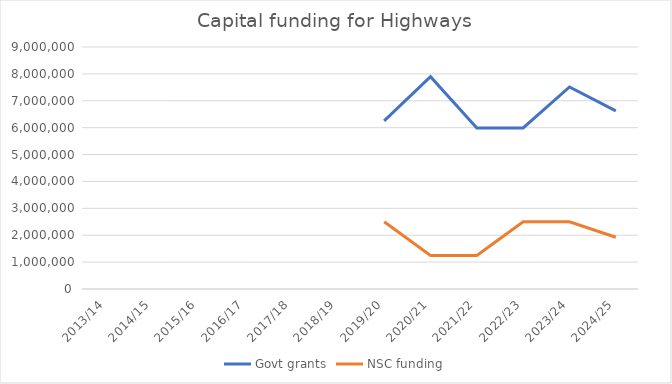
| Category | Govt grants | NSC funding |
|---|---|---|
| 2013/14 | 0 | 0 |
| 2014/15 | 0 | 0 |
| 2015/16 | 0 | 0 |
| 2016/17 | 0 | 0 |
| 2017/18 | 0 | 0 |
| 2018/19 | 0 | 0 |
| 2019/20 | 6251795 | 2500000 |
| 2020/21 | 7895747 | 1250000 |
| 2021/22 | 5991000 | 1250000 |
| 2022/23 | 5991000 | 2500000 |
| 2023/24 | 7514000 | 2500000 |
| 2024/25 | 6623000 | 1926000 |